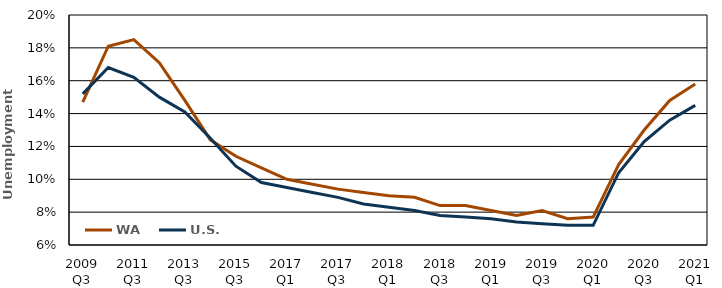
| Category | WA | U.S. |
|---|---|---|
| 2009 Q3 | 0.147 | 0.152 |
| 2010 Q3 | 0.181 | 0.168 |
| 2011 Q3 | 0.185 | 0.162 |
| 2012 Q3 | 0.171 | 0.15 |
| 2013 Q3 | 0.148 | 0.141 |
| 2014 Q3 | 0.124 | 0.125 |
| 2015 Q3 | 0.114 | 0.108 |
| 2016 Q3 | 0.107 | 0.098 |
| 2017 Q1 | 0.1 | 0.095 |
| 2017 Q2 | 0.097 | 0.092 |
| 2017 Q3 | 0.094 | 0.089 |
| 2017 Annual | 0.092 | 0.085 |
| 2018 Q1 | 0.09 | 0.083 |
| 2018 Q2 | 0.089 | 0.081 |
| 2018 Q3 | 0.084 | 0.078 |
| 2018 Annual | 0.084 | 0.077 |
| 2019 Q1 | 0.081 | 0.076 |
| 2019 Q2 | 0.078 | 0.074 |
| 2019 Q3 | 0.081 | 0.073 |
| 2019 Annual | 0.076 | 0.072 |
| 2020 Q1 | 0.077 | 0.072 |
| 2020 Q2 | 0.109 | 0.104 |
| 2020 Q3 | 0.13 | 0.123 |
| 2020 Annual | 0.148 | 0.136 |
| 2021 Q1 | 0.158 | 0.145 |